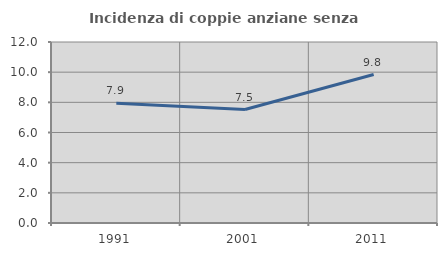
| Category | Incidenza di coppie anziane senza figli  |
|---|---|
| 1991.0 | 7.937 |
| 2001.0 | 7.525 |
| 2011.0 | 9.845 |